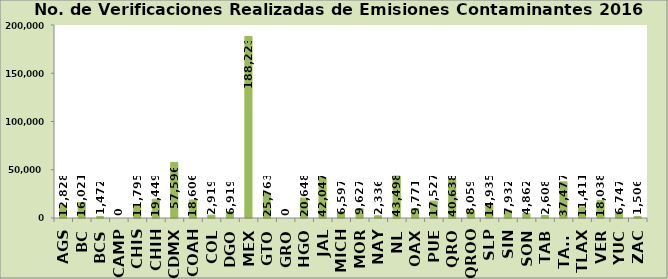
| Category | No. de Verificaciones Realizadas |
|---|---|
| AGS | 12828 |
| BC | 16021 |
| BCS | 1472 |
| CAMP | 0 |
| CHIS | 11795 |
| CHIH | 19449 |
| CDMX | 57596 |
| COAH | 18606 |
| COL | 2919 |
| DGO | 6919 |
| MEX | 188223 |
| GTO | 25763 |
| GRO | 0 |
| HGO | 20648 |
| JAL | 42047 |
| MICH | 6597 |
| MOR | 9627 |
| NAY | 2336 |
| NL | 43498 |
| OAX | 9771 |
| PUE | 17527 |
| QRO | 40638 |
| QROO | 8059 |
| SLP | 14935 |
| SIN | 7932 |
| SON | 4862 |
| TAB | 2608 |
| TAMS | 37477 |
| TLAX | 11411 |
| VER | 18038 |
| YUC | 6747 |
| ZAC | 1506 |